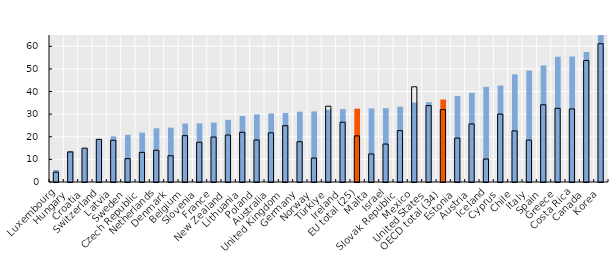
| Category | Foreign-born | Native-born |
|---|---|---|
| Luxembourg | 5.298 | 4.333 |
| Hungary | 13.759 | 13.288 |
| Croatia | 14.842 | 14.971 |
| Switzerland | 19.05 | 18.853 |
| Latvia | 20.202 | 18.453 |
| Sweden | 20.878 | 10.331 |
| Czech Republic | 21.841 | 13.101 |
| Netherlands | 23.75 | 14.032 |
| Denmark | 24.028 | 11.595 |
| Belgium | 25.838 | 20.494 |
| Slovenia | 25.91 | 17.581 |
| France | 26.273 | 19.886 |
| New Zealand | 27.491 | 20.774 |
| Lithuania | 29.24 | 21.972 |
| Poland | 29.883 | 18.582 |
| Australia | 30.301 | 21.747 |
| United Kingdom | 30.526 | 24.896 |
| Germany | 31.092 | 17.81 |
| Norway | 31.216 | 10.588 |
| Türkiye | 32.037 | 33.521 |
| Ireland | 32.249 | 26.422 |
| EU total (25) | 32.416 | 20.382 |
| Malta | 32.531 | 12.39 |
| Israel | 32.64 | 16.78 |
| Slovak Republic | 33.293 | 22.721 |
| Mexico | 35.1 | 42.1 |
| United States | 35.29 | 33.78 |
| OECD total (34) | 36.462 | 31.991 |
| Estonia | 38.012 | 19.391 |
| Austria | 39.451 | 25.694 |
| Iceland | 42.063 | 10.157 |
| Cyprus | 42.643 | 30.039 |
| Chile | 47.6 | 22.6 |
| Italy | 49.306 | 18.533 |
| Spain | 51.554 | 34.154 |
| Greece | 55.395 | 32.557 |
| Costa Rica | 55.5 | 32.3 |
| Canada | 57.43 | 53.711 |
| Korea | 72.717 | 61.133 |